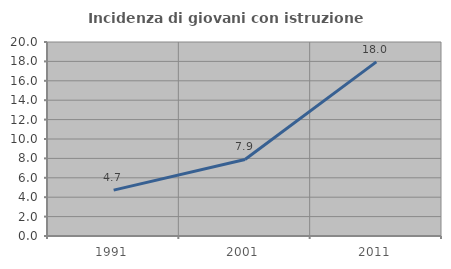
| Category | Incidenza di giovani con istruzione universitaria |
|---|---|
| 1991.0 | 4.731 |
| 2001.0 | 7.89 |
| 2011.0 | 17.954 |